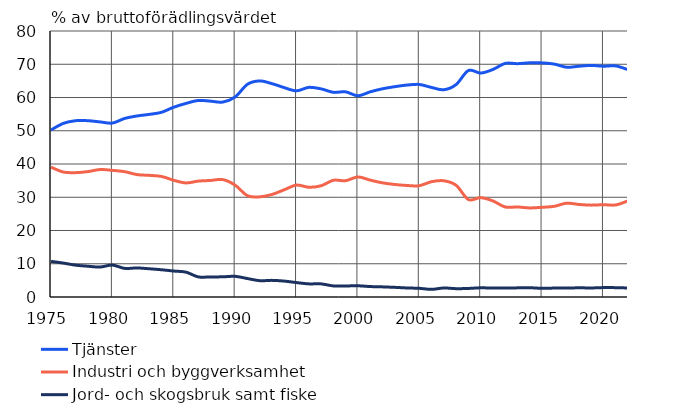
| Category | Tjänster  | Industri och byggverksamhet | Jord- och skogsbruk samt fiske |
|---|---|---|---|
| 1975 | 50.23 | 39.06 | 10.71 |
| 1976 | 52.213 | 37.585 | 10.202 |
| 1977 | 53.022 | 37.399 | 9.578 |
| 1978 | 53.029 | 37.712 | 9.259 |
| 1979 | 52.655 | 38.335 | 9.01 |
| 1980 | 52.314 | 38.087 | 9.6 |
| 1981 | 53.705 | 37.694 | 8.601 |
| 1982 | 54.446 | 36.817 | 8.737 |
| 1983 | 54.923 | 36.585 | 8.492 |
| 1984 | 55.548 | 36.257 | 8.195 |
| 1985 | 57.09 | 35.103 | 7.807 |
| 1986 | 58.223 | 34.309 | 7.468 |
| 1987 | 59.106 | 34.854 | 6.039 |
| 1988 | 58.899 | 35.049 | 6.052 |
| 1989 | 58.631 | 35.305 | 6.064 |
| 1990 | 60.156 | 33.633 | 6.211 |
| 1991 | 63.976 | 30.478 | 5.547 |
| 1992 | 64.979 | 30.114 | 4.906 |
| 1993 | 64.163 | 30.836 | 5.002 |
| 1994 | 62.97 | 32.246 | 4.783 |
| 1995 | 62.007 | 33.659 | 4.334 |
| 1996 | 63.045 | 33.008 | 3.948 |
| 1997 | 62.597 | 33.458 | 3.946 |
| 1998 | 61.561 | 35.105 | 3.334 |
| 1999 | 61.703 | 34.98 | 3.317 |
| 2000 | 60.52 | 36.105 | 3.376 |
| 2001 | 61.701 | 35.158 | 3.141 |
| 2002 | 62.619 | 34.334 | 3.047 |
| 2003 | 63.256 | 33.839 | 2.906 |
| 2004 | 63.742 | 33.54 | 2.717 |
| 2005 | 63.92 | 33.473 | 2.607 |
| 2006 | 63.023 | 34.682 | 2.295 |
| 2007 | 62.333 | 34.954 | 2.713 |
| 2008 | 63.897 | 33.597 | 2.506 |
| 2009 | 68.106 | 29.319 | 2.575 |
| 2010 | 67.348 | 29.888 | 2.764 |
| 2011 | 68.437 | 28.885 | 2.679 |
| 2012 | 70.256 | 27.064 | 2.679 |
| 2013 | 70.175 | 27.077 | 2.749 |
| 2014 | 70.433 | 26.785 | 2.781 |
| 2015 | 70.411 | 26.98 | 2.609 |
| 2016 | 70.043 | 27.275 | 2.682 |
| 2017 | 69.107 | 28.215 | 2.678 |
| 2018 | 69.403 | 27.829 | 2.768 |
| 2019 | 69.652 | 27.63 | 2.718 |
| 2020 | 69.415 | 27.753 | 2.831 |
| 2021 | 69.502 | 27.686 | 2.812 |
| 2022* | 68.372 | 28.919 | 2.71 |